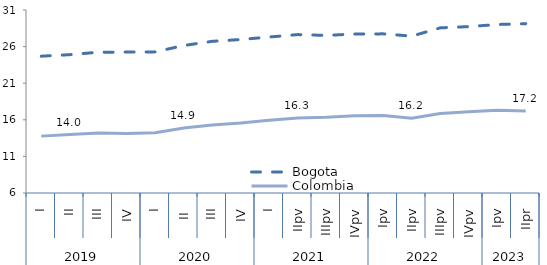
| Category | Bogota | Colombia |
|---|---|---|
| 0 | 24.69 | 13.77 |
| 1 | 24.9 | 13.99 |
| 2 | 25.23 | 14.2 |
| 3 | 25.25 | 14.14 |
| 4 | 25.28 | 14.23 |
| 5 | 26.15 | 14.88 |
| 6 | 26.72 | 15.29 |
| 7 | 26.97 | 15.56 |
| 8 | 27.31 | 15.93 |
| 9 | 27.64 | 16.26 |
| 10 | 27.53 | 16.36 |
| 11 | 27.72 | 16.56 |
| 12 | 27.74 | 16.58 |
| 13 | 27.43 | 16.22 |
| 14 | 28.56 | 16.86 |
| 15 | 28.73 | 17.09 |
| 16 | 29.02 | 17.3 |
| 17 | 29.133 | 17.2 |